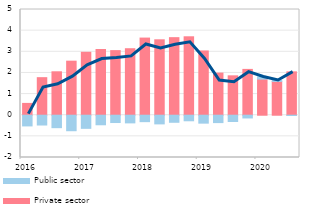
| Category | Private sector  | Public sector |
|---|---|---|
| 2016 | 0.559 | -0.507 |
| II | 1.776 | -0.463 |
| III | 2.053 | -0.589 |
| IV | 2.556 | -0.733 |
| 2017 | 2.977 | -0.621 |
| II | 3.109 | -0.452 |
| III | 3.055 | -0.347 |
| IV | 3.145 | -0.363 |
| 2018 | 3.649 | -0.305 |
| II | 3.567 | -0.411 |
| III | 3.668 | -0.334 |
| IV | 3.71 | -0.263 |
| 2019 | 3.039 | -0.375 |
| II | 1.992 | -0.349 |
| III | 1.862 | -0.298 |
| IV | 2.168 | -0.13 |
| 2020 | 1.708 | 0.102 |
| II | 1.599 | 0.045 |
| III | 2.051 | -0.014 |